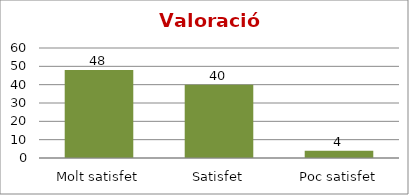
| Category | Series 0 |
|---|---|
| Molt satisfet | 48 |
| Satisfet | 40 |
| Poc satisfet | 4 |